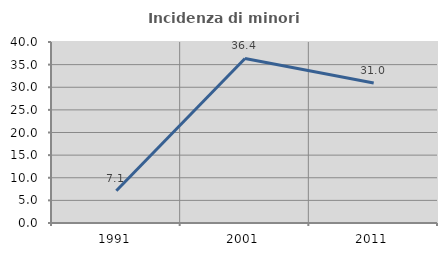
| Category | Incidenza di minori stranieri |
|---|---|
| 1991.0 | 7.143 |
| 2001.0 | 36.364 |
| 2011.0 | 30.952 |